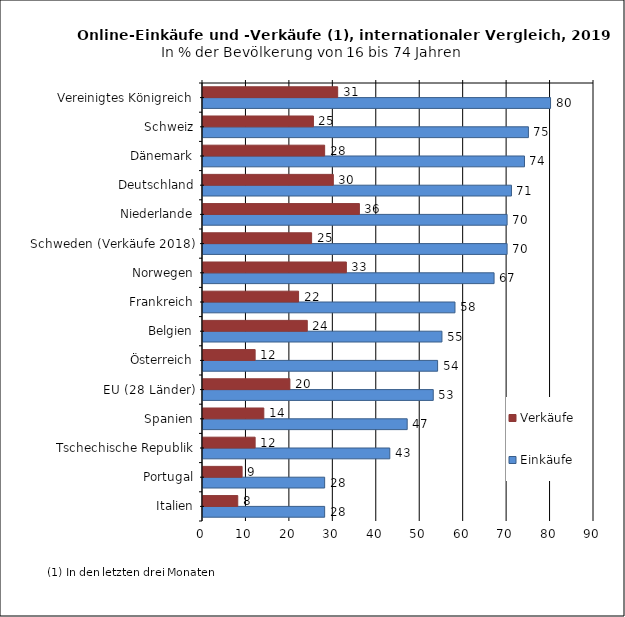
| Category | Einkäufe | Verkäufe |
|---|---|---|
| Italien | 28 | 8 |
| Portugal | 28 | 9 |
| Tschechische Republik | 43 | 12 |
| Spanien | 47 | 14 |
| EU (28 Länder) | 53 | 20 |
| Österreich | 54 | 12 |
| Belgien | 55 | 24 |
| Frankreich | 58 | 22 |
| Norwegen | 67 | 33 |
| Schweden (Verkäufe 2018) | 70 | 25 |
| Niederlande | 70 | 36 |
| Deutschland | 71 | 30 |
| Dänemark | 74 | 28 |
| Schweiz | 74.905 | 25.417 |
| Vereinigtes Königreich | 80 | 31 |